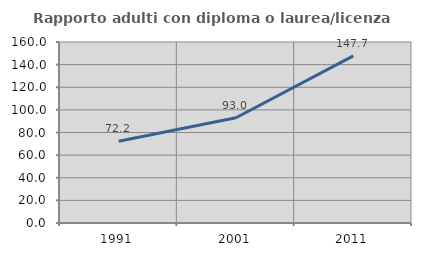
| Category | Rapporto adulti con diploma o laurea/licenza media  |
|---|---|
| 1991.0 | 72.222 |
| 2001.0 | 93.046 |
| 2011.0 | 147.712 |